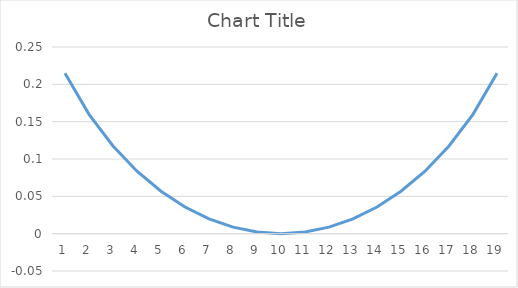
| Category | Series 0 |
|---|---|
| 0 | 0.215 |
| 1 | 0.16 |
| 2 | 0.117 |
| 3 | 0.084 |
| 4 | 0.057 |
| 5 | 0.036 |
| 6 | 0.02 |
| 7 | 0.009 |
| 8 | 0.002 |
| 9 | 0 |
| 10 | 0.002 |
| 11 | 0.009 |
| 12 | 0.02 |
| 13 | 0.036 |
| 14 | 0.057 |
| 15 | 0.084 |
| 16 | 0.117 |
| 17 | 0.16 |
| 18 | 0.215 |